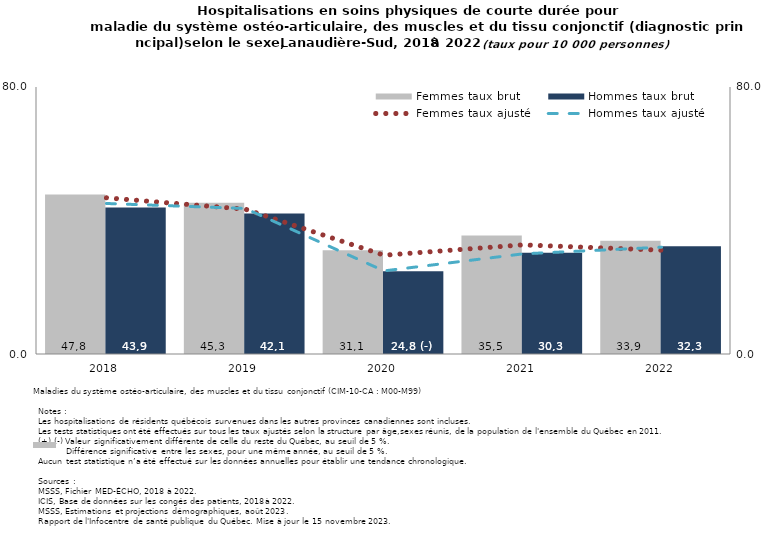
| Category | Femmes taux brut | Hommes taux brut |
|---|---|---|
| 2018.0 | 47.8 | 43.9 |
| 2019.0 | 45.3 | 42.1 |
| 2020.0 | 31.1 | 24.8 |
| 2021.0 | 35.5 | 30.3 |
| 2022.0 | 33.9 | 32.3 |